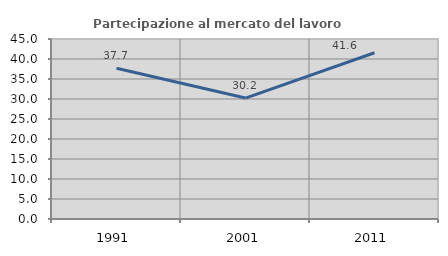
| Category | Partecipazione al mercato del lavoro  femminile |
|---|---|
| 1991.0 | 37.705 |
| 2001.0 | 30.238 |
| 2011.0 | 41.568 |